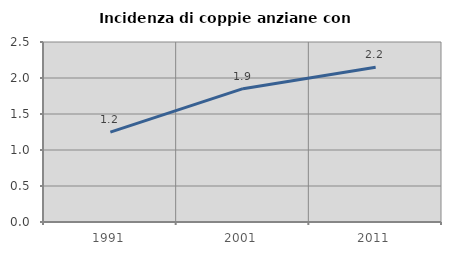
| Category | Incidenza di coppie anziane con figli |
|---|---|
| 1991.0 | 1.248 |
| 2001.0 | 1.852 |
| 2011.0 | 2.151 |